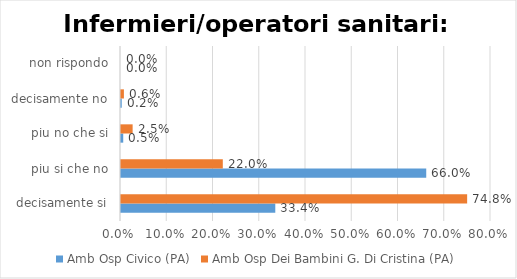
| Category | Amb Osp Civico (PA) | Amb Osp Dei Bambini G. Di Cristina (PA) |
|---|---|---|
| decisamente si | 0.334 | 0.748 |
| piu si che no | 0.66 | 0.22 |
| piu no che si | 0.005 | 0.025 |
| decisamente no | 0.002 | 0.006 |
| non rispondo | 0 | 0 |